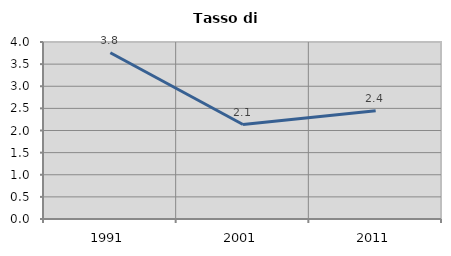
| Category | Tasso di disoccupazione   |
|---|---|
| 1991.0 | 3.756 |
| 2001.0 | 2.135 |
| 2011.0 | 2.446 |